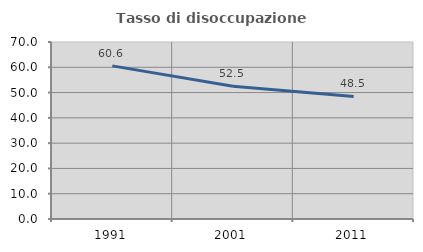
| Category | Tasso di disoccupazione giovanile  |
|---|---|
| 1991.0 | 60.553 |
| 2001.0 | 52.5 |
| 2011.0 | 48.474 |